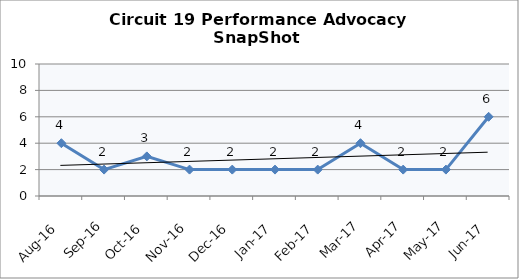
| Category | Circuit 19 |
|---|---|
| Aug-16 | 4 |
| Sep-16 | 2 |
| Oct-16 | 3 |
| Nov-16 | 2 |
| Dec-16 | 2 |
| Jan-17 | 2 |
| Feb-17 | 2 |
| Mar-17 | 4 |
| Apr-17 | 2 |
| May-17 | 2 |
| Jun-17 | 6 |